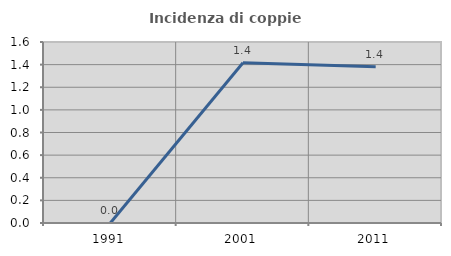
| Category | Incidenza di coppie miste |
|---|---|
| 1991.0 | 0 |
| 2001.0 | 1.416 |
| 2011.0 | 1.381 |